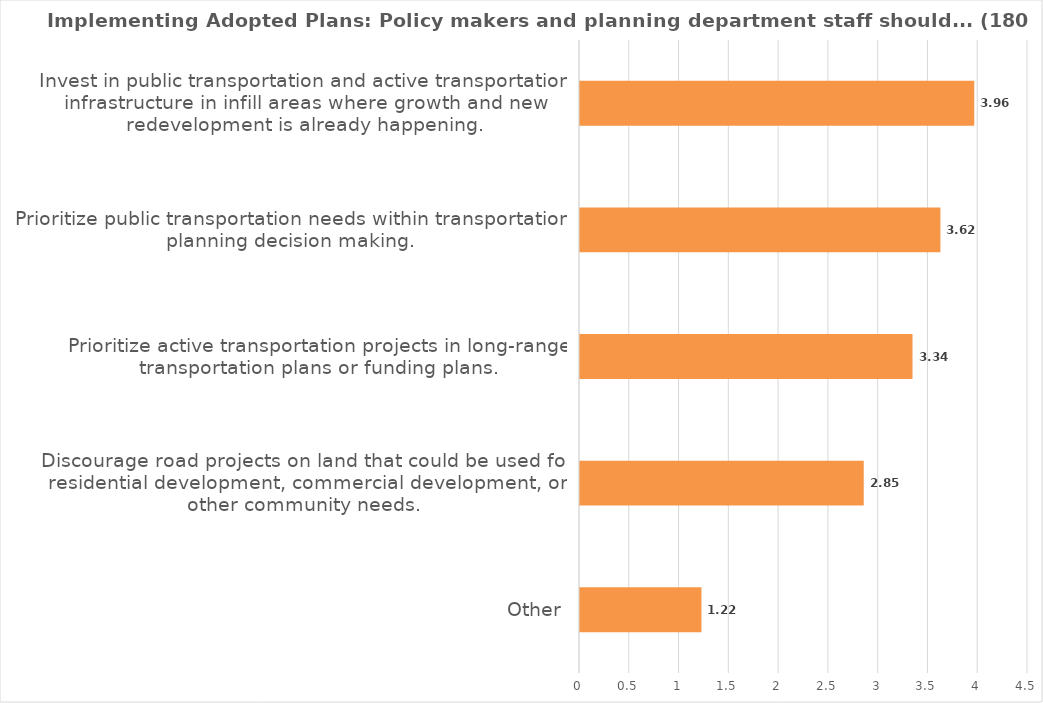
| Category | Score |
|---|---|
| Other | 1.22 |
| Discourage road projects on land that could be used for residential development, commercial development, or other community needs. | 2.85 |
| Prioritize active transportation projects in long-range transportation plans or funding plans. | 3.34 |
| Prioritize public transportation needs within transportation planning decision making. | 3.62 |
| Invest in public transportation and active transportation infrastructure in infill areas where growth and new redevelopment is already happening. | 3.96 |